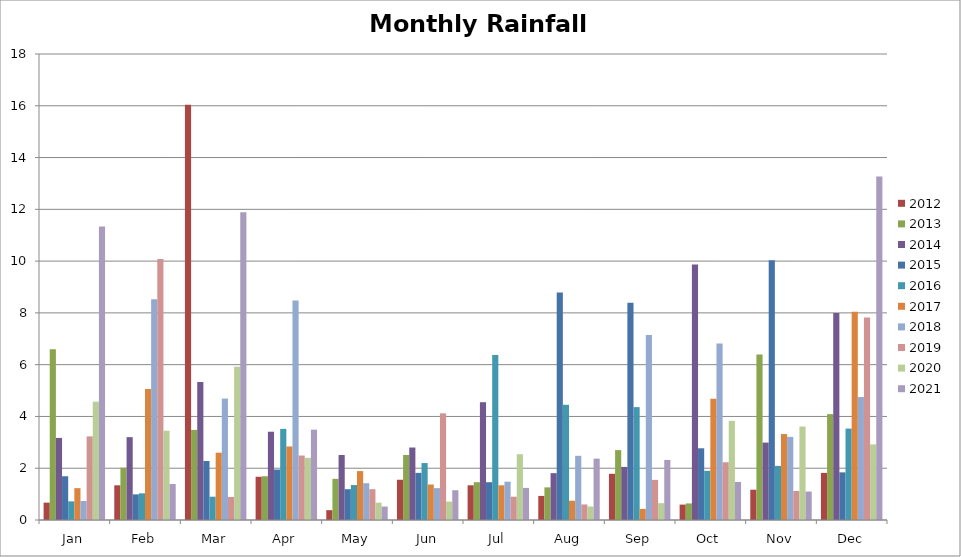
| Category | 2012 | 2013 | 2014 | 2015 | 2016 | 2017 | 2018 | 2019 | 2020 | 2021 |
|---|---|---|---|---|---|---|---|---|---|---|
| Jan | 0.67 | 6.6 | 3.17 | 1.69 | 0.72 | 1.23 | 0.735 | 3.23 | 4.57 | 11.34 |
| Feb | 1.34 | 2.02 | 3.2 | 0.99 | 1.03 | 5.06 | 8.525 | 10.08 | 3.45 | 1.39 |
| Mar | 16.04 | 3.48 | 5.33 | 2.28 | 0.9 | 2.6 | 4.69 | 0.89 | 5.92 | 11.89 |
| Apr | 1.67 | 1.69 | 3.41 | 1.95 | 3.52 | 2.84 | 8.48 | 2.49 | 2.4 | 3.49 |
| May | 0.38 | 1.59 | 2.51 | 1.19 | 1.35 | 1.89 | 1.42 | 1.19 | 0.67 | 0.52 |
| Jun | 1.555 | 2.51 | 2.8 | 1.82 | 2.2 | 1.37 | 1.23 | 4.12 | 0.71 | 1.15 |
| Jul | 1.34 | 1.46 | 4.55 | 1.46 | 6.37 | 1.34 | 1.48 | 0.9 | 2.54 | 1.24 |
| Aug | 0.93 | 1.26 | 1.81 | 8.79 | 4.45 | 0.745 | 2.48 | 0.6 | 0.52 | 2.37 |
| Sep | 1.785 | 2.7 | 2.05 | 8.39 | 4.36 | 0.43 | 7.15 | 1.55 | 0.65 | 2.32 |
| Oct | 0.595 | 0.64 | 9.87 | 2.77 | 1.9 | 4.685 | 6.82 | 2.23 | 3.83 | 1.47 |
| Nov | 1.17 | 6.39 | 2.99 | 10.03 | 2.09 | 3.32 | 3.21 | 1.12 | 3.61 | 1.1 |
| Dec | 1.82 | 4.09 | 8 | 1.84 | 3.53 | 8.04 | 4.75 | 7.82 | 2.92 | 13.27 |